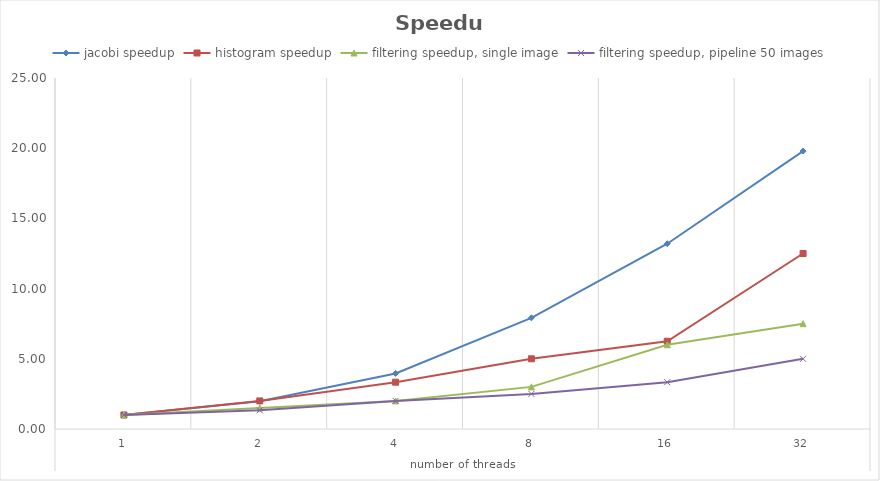
| Category | jacobi speedup | histogram speedup | filtering speedup, single image | filtering speedup, pipeline 50 images |
|---|---|---|---|---|
| 0 | 1 | 1 | 1 | 1 |
| 1 | 1.98 | 2 | 1.5 | 1.333 |
| 2 | 3.959 | 3.333 | 2 | 2 |
| 3 | 7.918 | 5 | 3 | 2.5 |
| 4 | 13.197 | 6.25 | 6 | 3.333 |
| 5 | 19.795 | 12.5 | 7.5 | 5 |